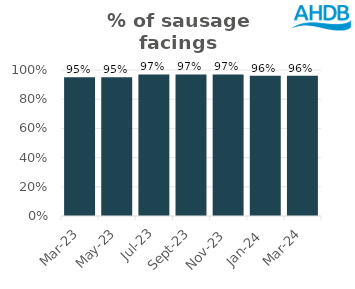
| Category | Sausage |
|---|---|
| 2023-03-01 | 0.95 |
| 2023-05-01 | 0.95 |
| 2023-07-01 | 0.97 |
| 2023-09-01 | 0.97 |
| 2023-11-01 | 0.97 |
| 2024-01-01 | 0.96 |
| 2024-03-01 | 0.96 |